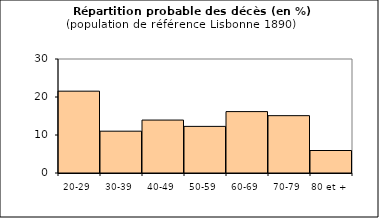
| Category | Series 0 |
|---|---|
| 20-29 | 21.537 |
| 30-39 | 11.007 |
| 40-49 | 13.929 |
| 50-59 | 12.267 |
| 60-69 | 16.159 |
| 70-79 | 15.089 |
| 80 et + | 5.918 |